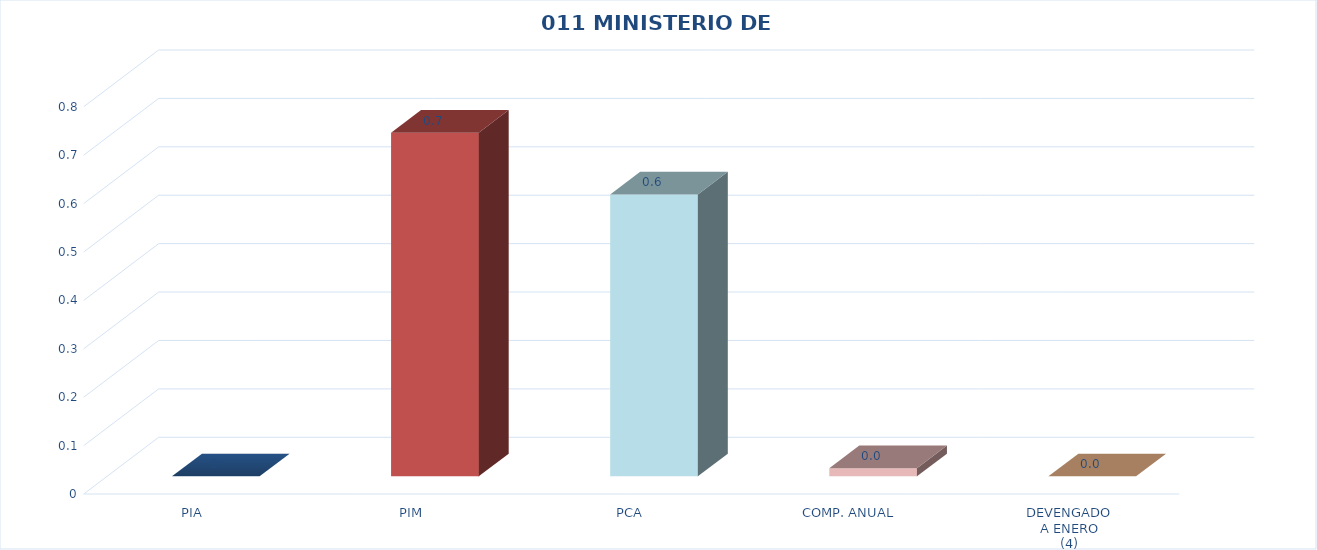
| Category | 011 MINISTERIO DE SALUD |
|---|---|
| PIA | 0 |
| PIM | 0.71 |
| PCA | 0.582 |
| COMP. ANUAL | 0.017 |
| DEVENGADO
A ENERO
(4) | 0 |